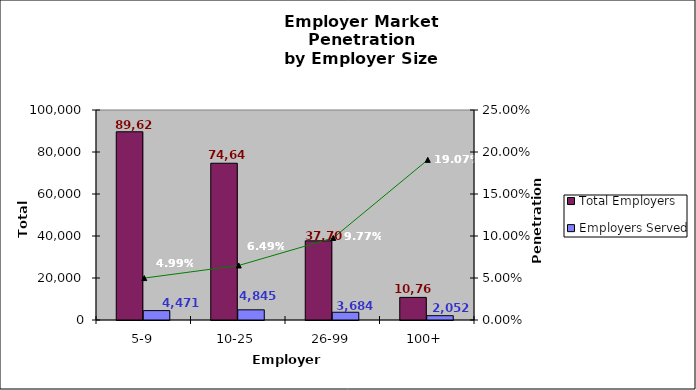
| Category | Total Employers | Employers Served |
|---|---|---|
| 5-9 | 89629 | 4471 |
| 10-25 | 74646 | 4845 |
| 26-99 | 37703 | 3684 |
| 100+ | 10763 | 2052 |